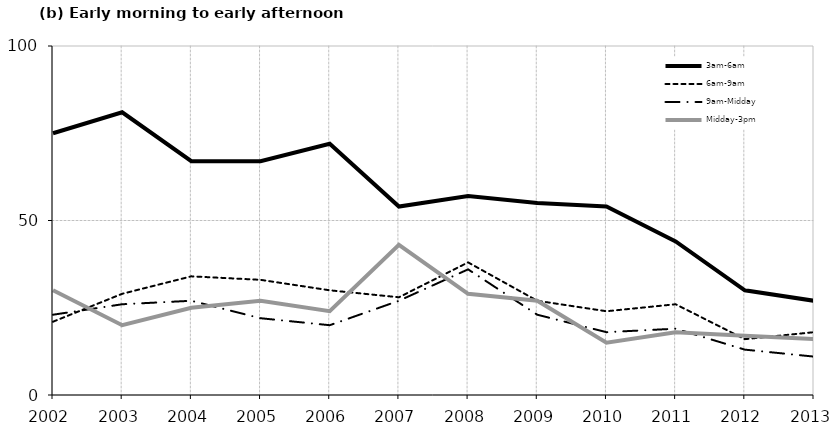
| Category | 3am-6am | 6am-9am | 9am-Midday | Midday-3pm |
|---|---|---|---|---|
| 2002.0 | 75 | 21 | 23 | 30 |
| 2003.0 | 81 | 29 | 26 | 20 |
| 2004.0 | 67 | 34 | 27 | 25 |
| 2005.0 | 67 | 33 | 22 | 27 |
| 2006.0 | 72 | 30 | 20 | 24 |
| 2007.0 | 54 | 28 | 27 | 43 |
| 2008.0 | 57 | 38 | 36 | 29 |
| 2009.0 | 55 | 27 | 23 | 27 |
| 2010.0 | 54 | 24 | 18 | 15 |
| 2011.0 | 44 | 26 | 19 | 18 |
| 2012.0 | 30 | 16 | 13 | 17 |
| 2013.0 | 27 | 18 | 11 | 16 |